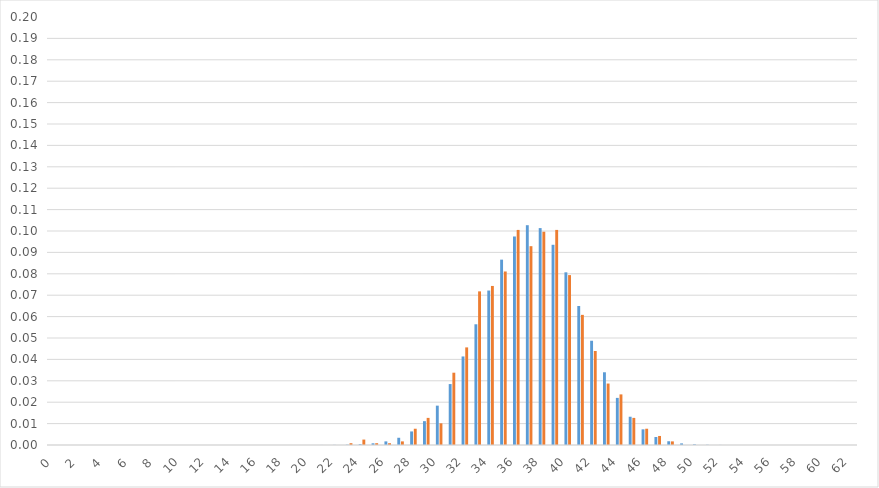
| Category | vsz | rekgyak |
|---|---|---|
| 0.0 | 0 | 0 |
| 1.0 | 0 | 0 |
| 2.0 | 0 | 0 |
| 3.0 | 0 | 0 |
| 4.0 | 0 | 0 |
| 5.0 | 0 | 0 |
| 6.0 | 0 | 0 |
| 7.0 | 0 | 0 |
| 8.0 | 0 | 0 |
| 9.0 | 0 | 0 |
| 10.0 | 0 | 0 |
| 11.0 | 0 | 0 |
| 12.0 | 0 | 0 |
| 13.0 | 0 | 0 |
| 14.0 | 0 | 0 |
| 15.0 | 0 | 0 |
| 16.0 | 0 | 0 |
| 17.0 | 0 | 0 |
| 18.0 | 0 | 0 |
| 19.0 | 0 | 0 |
| 20.0 | 0 | 0 |
| 21.0 | 0 | 0 |
| 22.0 | 0 | 0 |
| 23.0 | 0 | 0.001 |
| 24.0 | 0 | 0.003 |
| 25.0 | 0.001 | 0.001 |
| 26.0 | 0.002 | 0.001 |
| 27.0 | 0.003 | 0.002 |
| 28.0 | 0.006 | 0.008 |
| 29.0 | 0.011 | 0.013 |
| 30.0 | 0.018 | 0.01 |
| 31.0 | 0.028 | 0.034 |
| 32.0 | 0.041 | 0.046 |
| 33.0 | 0.056 | 0.072 |
| 34.0 | 0.072 | 0.074 |
| 35.0 | 0.087 | 0.081 |
| 36.0 | 0.097 | 0.101 |
| 37.0 | 0.103 | 0.093 |
| 38.0 | 0.101 | 0.1 |
| 39.0 | 0.094 | 0.101 |
| 40.0 | 0.081 | 0.079 |
| 41.0 | 0.065 | 0.061 |
| 42.0 | 0.049 | 0.044 |
| 43.0 | 0.034 | 0.029 |
| 44.0 | 0.022 | 0.024 |
| 45.0 | 0.013 | 0.013 |
| 46.0 | 0.007 | 0.008 |
| 47.0 | 0.004 | 0.004 |
| 48.0 | 0.002 | 0.002 |
| 49.0 | 0.001 | 0 |
| 50.0 | 0 | 0 |
| 51.0 | 0 | 0 |
| 52.0 | 0 | 0 |
| 53.0 | 0 | 0 |
| 54.0 | 0 | 0 |
| 55.0 | 0 | 0 |
| 56.0 | 0 | 0 |
| 57.0 | 0 | 0 |
| 58.0 | 0 | 0 |
| 59.0 | 0 | 0 |
| 60.0 | 0 | 0 |
| 61.0 | 0 | 0 |
| 62.0 | 0 | 0 |